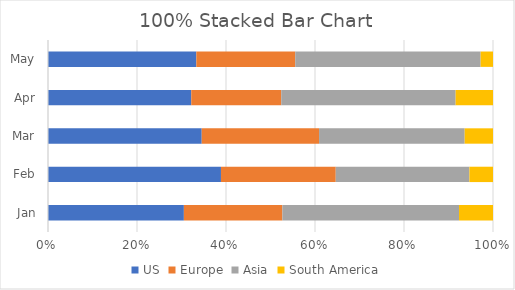
| Category | US | Europe | Asia | South America |
|---|---|---|---|---|
| Jan | 20000 | 14500 | 26000 | 5000 |
| Feb | 22000 | 14600 | 17000 | 3000 |
| Mar | 19000 | 14500 | 18000 | 3500 |
| Apr | 23000 | 14450 | 28000 | 6000 |
| May | 24000 | 16000 | 30000 | 2000 |